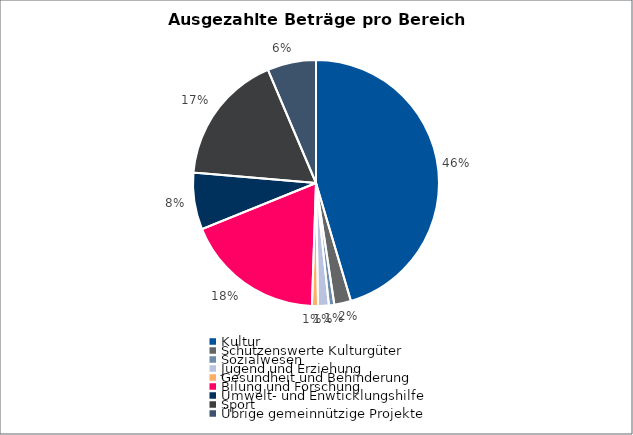
| Category | Series 0 |
|---|---|
| Kultur | 22017000 |
| Schützenswerte Kulturgüter | 1064000 |
| Sozialwesen | 344000 |
| Jugend und Erziehung | 685000 |
| Gesundheit und Behinderung | 382000 |
| Bilung und Forschung | 8901000 |
| Umwelt- und Enwticklungshilfe | 3621000 |
| Sport | 8363000 |
| Übrige gemeinnützige Projekte | 3098000 |